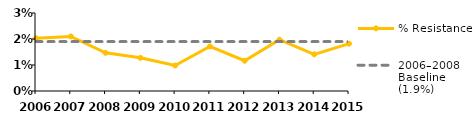
| Category | % Resistance | 2006–2008 Baseline (1.9%) |
|---|---|---|
| 2006.0 | 0.02 | 0.019 |
| 2007.0 | 0.021 | 0.019 |
| 2008.0 | 0.015 | 0.019 |
| 2009.0 | 0.013 | 0.019 |
| 2010.0 | 0.01 | 0.019 |
| 2011.0 | 0.017 | 0.019 |
| 2012.0 | 0.012 | 0.019 |
| 2013.0 | 0.02 | 0.019 |
| 2014.0 | 0.014 | 0.019 |
| 2015.0 | 0.018 | 0.019 |